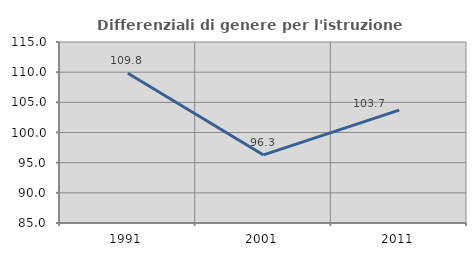
| Category | Differenziali di genere per l'istruzione superiore |
|---|---|
| 1991.0 | 109.831 |
| 2001.0 | 96.281 |
| 2011.0 | 103.71 |